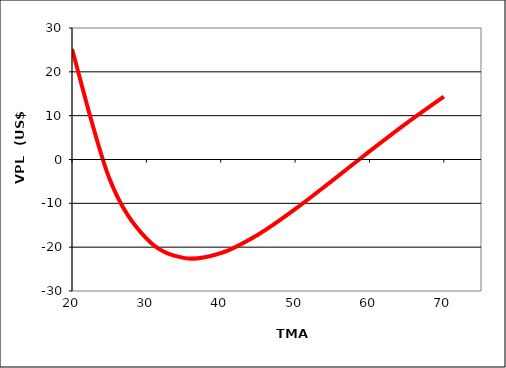
| Category | Series 0 |
|---|---|
| 20.0 | 25.215 |
| 25.0 | -4.201 |
| 30.0 | -18.016 |
| 35.0 | -22.451 |
| 40.0 | -21.364 |
| 45.0 | -17.16 |
| 50.0 | -11.335 |
| 55.0 | -4.813 |
| 60.0 | 1.84 |
| 65.0 | 8.291 |
| 70.0 | 14.35 |